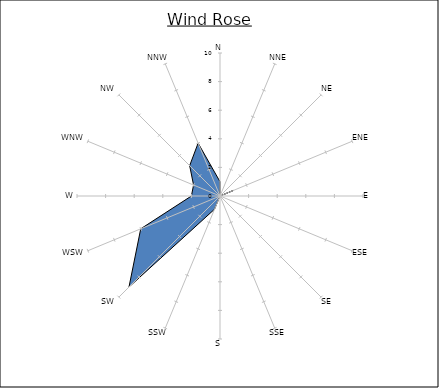
| Category | Series 0 |
|---|---|
| N | 1 |
| NNE | 0 |
| NE | 0 |
| ENE | 1 |
| E | 0 |
| ESE | 0 |
| SE | 1 |
| SSE | 0 |
| S | 0 |
| SSW | 1 |
| SW | 9 |
| WSW | 6 |
| W | 2 |
| WNW | 2 |
| NW | 3 |
| NNW | 4 |